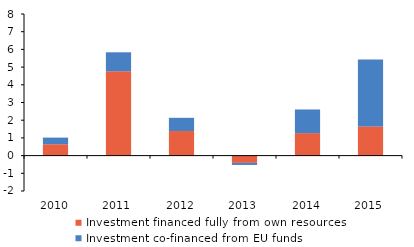
| Category | Investment financed fully from own resources | Investment co-financed from EU funds |
|---|---|---|
| 2010.0 | 0.642 | 0.374 |
| 2011.0 | 4.763 | 1.074 |
| 2012.0 | 1.388 | 0.746 |
| 2013.0 | -0.412 | -0.116 |
| 2014.0 | 1.271 | 1.335 |
| 2015.0 | 1.65 | 3.781 |